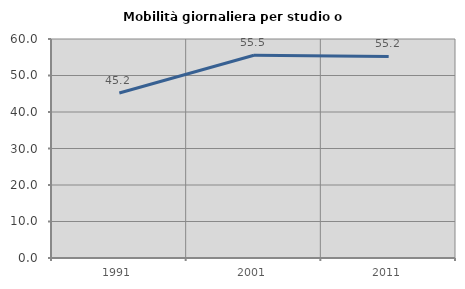
| Category | Mobilità giornaliera per studio o lavoro |
|---|---|
| 1991.0 | 45.202 |
| 2001.0 | 55.535 |
| 2011.0 | 55.231 |